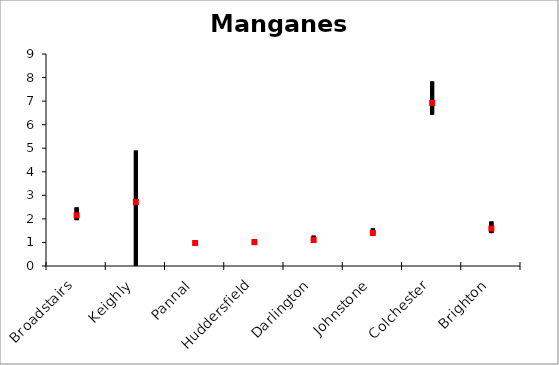
| Category | Sodium | Series 1 | Series 2 |
|---|---|---|---|
| Broadstairs | 2.483 | 1.948 | 2.151 |
| Keighly | 4.895 | 0 | 2.715 |
| Pannal | 1.09 | 0.863 | 0.975 |
| Huddersfield | 1.147 | 0.903 | 1.012 |
| Darlington | 1.285 | 1.007 | 1.103 |
| Johnstone | 1.592 | 1.277 | 1.408 |
| Colchester | 7.829 | 6.428 | 6.922 |
| Brighton | 1.885 | 1.397 | 1.591 |